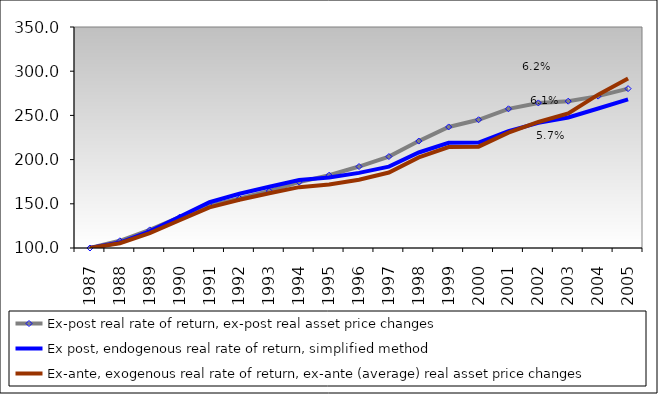
| Category | Ex-post real rate of return, ex-post real asset price changes | Ex post, endogenous real rate of return, simplified method | Ex-ante, exogenous real rate of return, ex-ante (average) real asset price changes |
|---|---|---|---|
| 1987.0 | 100 | 100 | 100 |
| 1988.0 | 108.123 | 106.163 | 105.396 |
| 1989.0 | 120.464 | 118.846 | 116.89 |
| 1990.0 | 134.897 | 135.29 | 131.394 |
| 1991.0 | 147.777 | 151.757 | 146.041 |
| 1992.0 | 156.189 | 161.349 | 154.51 |
| 1993.0 | 164.493 | 169.327 | 161.921 |
| 1994.0 | 174.565 | 176.831 | 168.832 |
| 1995.0 | 182.328 | 179.755 | 171.921 |
| 1996.0 | 192.154 | 184.983 | 177.274 |
| 1997.0 | 203.452 | 192.074 | 185.404 |
| 1998.0 | 220.96 | 208.061 | 202.419 |
| 1999.0 | 236.933 | 218.955 | 214.194 |
| 2000.0 | 245.069 | 219.309 | 214.639 |
| 2001.0 | 257.449 | 232.198 | 230.556 |
| 2002.0 | 264.104 | 241.537 | 242.557 |
| 2003.0 | 266.111 | 247.614 | 252.196 |
| 2004.0 | 271.81 | 257.764 | 273.447 |
| 2005.0 | 280.291 | 268.15 | 291.778 |